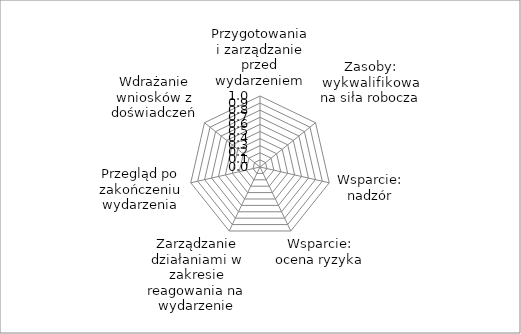
| Category | Series 0 |
|---|---|
| Przygotowania i zarządzanie przed wydarzeniem | 0 |
| Zasoby: wykwalifikowana siła robocza | 0 |
| Wsparcie: nadzór | 0 |
| Wsparcie: ocena ryzyka | 0 |
| Zarządzanie działaniami w zakresie reagowania na wydarzenie | 0 |
| Przegląd po zakończeniu wydarzenia | 0 |
| Wdrażanie wniosków z doświadczeń | 0 |